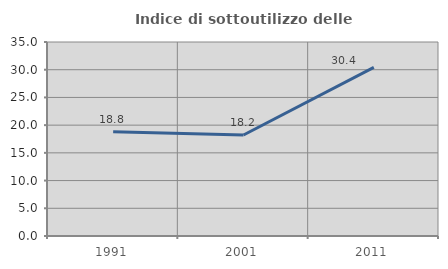
| Category | Indice di sottoutilizzo delle abitazioni  |
|---|---|
| 1991.0 | 18.793 |
| 2001.0 | 18.223 |
| 2011.0 | 30.424 |